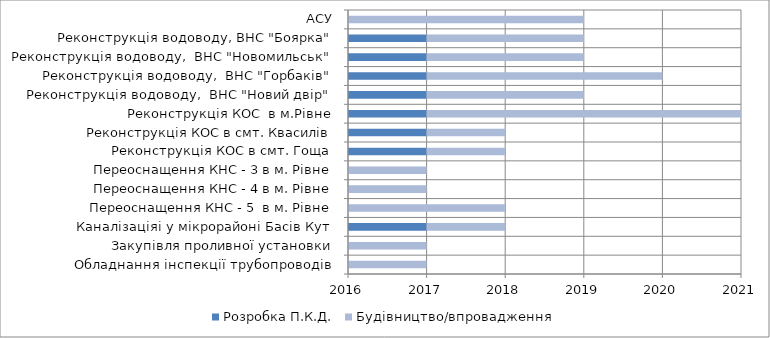
| Category | Series 0 | Розробка П.К.Д. | Будівництво/впровадження |
|---|---|---|---|
| Обладнання інспекції трубопроводів | 2016 | 0 | 1 |
| Закупівля проливної установки | 2016 | 0 | 1 |
| Каналізаціяі у мікрорайоні Басів Кут | 2016 | 1 | 1 |
| Переоснащення КНС - 5  в м. Рівне | 2016 | 0 | 2 |
| Переоснащення КНС - 4 в м. Рівне | 2016 | 0 | 1 |
| Переоснащення КНС - 3 в м. Рівне | 2016 | 0 | 1 |
| Реконструкція КОС в смт. Гоща | 2016 | 1 | 1 |
| Реконструкція КОС в смт. Квасилів | 2016 | 1 | 1 |
| Реконструкція КОС  в м.Рівне | 2016 | 1 | 4 |
| Реконструкція водоводу,  ВНС "Новий двір" | 2016 | 1 | 2 |
| Реконструкція водоводу,  ВНС "Горбаків" | 2016 | 1 | 3 |
| Реконструкція водоводу,  ВНС "Новомильськ" | 2016 | 1 | 2 |
| Реконструкція водоводу, ВНС "Боярка" | 2016 | 1 | 2 |
| АСУ | 2016 | 0 | 3 |